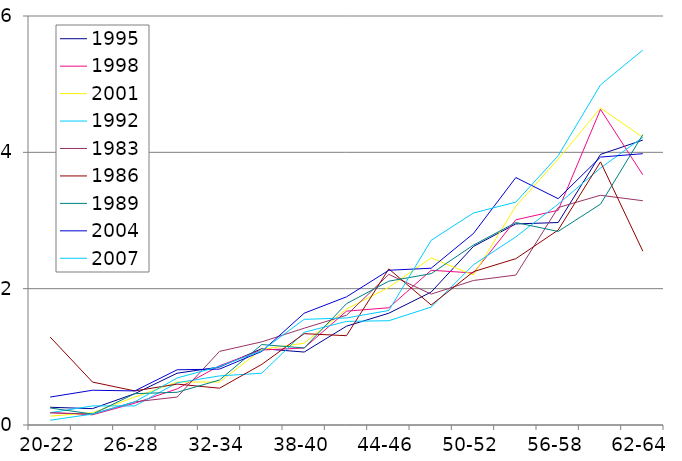
| Category | 1995 | 1998 | 2001 | 1992 | 1983 | 1986 | 1989 | 2004 | 2007 |
|---|---|---|---|---|---|---|---|---|---|
| 20-22 | 0.26 | 0.18 | 0.13 | 0.18 | 0.18 | 1.29 | 0.25 | 0.41 | 0.07 |
| 23-25 | 0.24 | 0.15 | 0.18 | 0.28 | 0.16 | 0.63 | 0.16 | 0.51 | 0.16 |
| 26-28 | 0.46 | 0.32 | 0.41 | 0.28 | 0.34 | 0.5 | 0.46 | 0.5 | 0.34 |
| 29-31 | 0.76 | 0.53 | 0.63 | 0.62 | 0.41 | 0.6 | 0.48 | 0.81 | 0.69 |
| 32-34 | 0.85 | 0.87 | 0.63 | 0.72 | 1.08 | 0.54 | 0.66 | 0.82 | 0.86 |
| 35-37 | 1.12 | 1.1 | 1.11 | 0.76 | 1.22 | 0.89 | 1.18 | 1.08 | 1.09 |
| 38-40 | 1.07 | 1.13 | 1.2 | 1.36 | 1.42 | 1.34 | 1.13 | 1.64 | 1.55 |
| 41-43 | 1.45 | 1.67 | 1.7 | 1.52 | 1.61 | 1.31 | 1.78 | 1.88 | 1.57 |
| 44-46 | 1.64 | 1.72 | 2.02 | 1.53 | 2.21 | 2.29 | 2.11 | 2.27 | 1.68 |
| 47-49 | 1.95 | 2.27 | 2.45 | 1.73 | 1.92 | 1.76 | 2.22 | 2.3 | 2.71 |
| 50-52 | 2.62 | 2.23 | 2.2 | 2.35 | 2.12 | 2.25 | 2.64 | 2.81 | 3.11 |
| 53-55 | 2.95 | 3.01 | 3.21 | 2.76 | 2.2 | 2.44 | 2.97 | 3.63 | 3.27 |
| 56-58 | 2.97 | 3.15 | 3.9 | 3.24 | 3.19 | 2.86 | 2.84 | 3.32 | 3.95 |
| 59-61 | 3.97 | 4.63 | 4.65 | 3.77 | 3.37 | 3.86 | 3.24 | 3.93 | 4.99 |
| 62-64 | 4.18 | 3.67 | 4.22 | 4.22 | 3.29 | 2.55 | 4.26 | 3.98 | 5.5 |